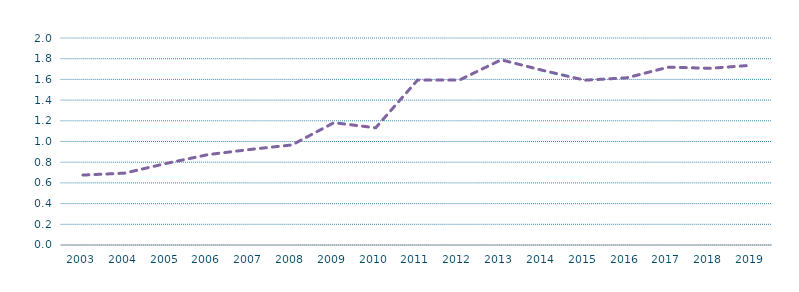
| Category | Generación resto de renovables/Generacion total (%) |
|---|---|
| 2003.0 | 0.676 |
| 2004.0 | 0.694 |
| 2005.0 | 0.789 |
| 2006.0 | 0.874 |
| 2007.0 | 0.923 |
| 2008.0 | 0.967 |
| 2009.0 | 1.182 |
| 2010.0 | 1.133 |
| 2011.0 | 1.593 |
| 2012.0 | 1.593 |
| 2013.0 | 1.789 |
| 2014.0 | 1.687 |
| 2015.0 | 1.592 |
| 2016.0 | 1.615 |
| 2017.0 | 1.718 |
| 2018.0 | 1.707 |
| 2019.0 | 1.737 |